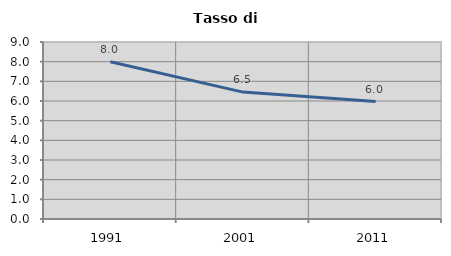
| Category | Tasso di disoccupazione   |
|---|---|
| 1991.0 | 8 |
| 2001.0 | 6.452 |
| 2011.0 | 5.97 |